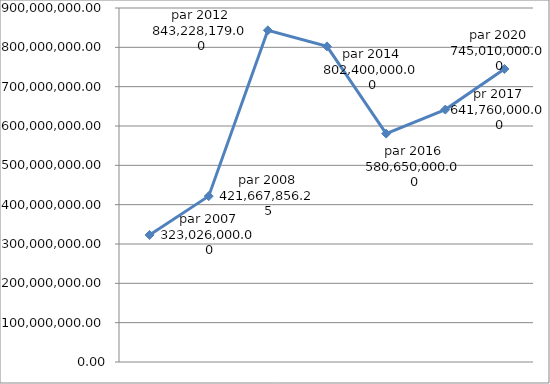
| Category | Series 0 |
|---|---|
| par 2007 | 323026000 |
| par 2008 | 421667856.25 |
| par 2012 | 843228179 |
| par 2014 | 802400000 |
| par 2016 | 580650000 |
| pr 2017 | 641760000 |
| par 2020 | 745010000 |